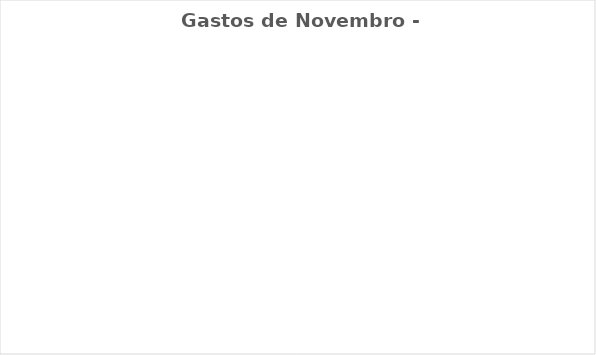
| Category | Gastos de Novembro - Real |
|---|---|
| Despesas Mensais | 0 |
| Aposentadoria/Pagar à si | 0 |
| Gratidão/ Doação/ Dizimo | 0 |
| Desejos | 0 |
| Dívidas/Investimentos | 0 |